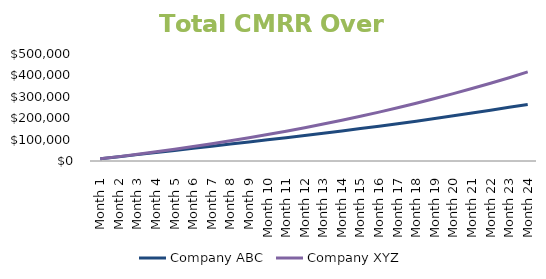
| Category | Company ABC | Company XYZ |
|---|---|---|
| 1.0 | 10000 | 10000 |
| 2.0 | 19931.026 | 20471.817 |
| 3.0 | 29811.014 | 31434.363 |
| 4.0 | 39657.656 | 42907.286 |
| 5.0 | 49488.435 | 54910.995 |
| 6.0 | 59320.652 | 67466.692 |
| 7.0 | 69171.463 | 80596.4 |
| 8.0 | 79057.907 | 94322.998 |
| 9.0 | 88996.939 | 108670.253 |
| 10.0 | 99005.459 | 123662.85 |
| 11.0 | 109100.341 | 139326.435 |
| 12.0 | 119298.466 | 155687.645 |
| 13.0 | 129746.88 | 172758.476 |
| 14.0 | 140458.579 | 190566.817 |
| 15.0 | 151446.982 | 209141.633 |
| 16.0 | 162725.947 | 228513.01 |
| 17.0 | 174309.785 | 248712.193 |
| 18.0 | 186213.289 | 269771.636 |
| 19.0 | 198451.745 | 291725.046 |
| 20.0 | 211040.958 | 314607.43 |
| 21.0 | 223997.27 | 338455.147 |
| 22.0 | 237337.588 | 363305.961 |
| 23.0 | 251079.402 | 389199.092 |
| 24.0 | 264327 | 416370.938 |